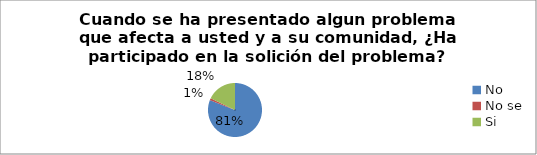
| Category | Series 0 |
|---|---|
| No | 0.81 |
| No se  | 0.012 |
| Si | 0.179 |